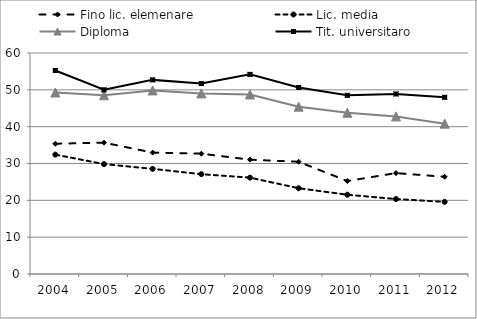
| Category | Fino lic. elemenare | Lic. media | Diploma | Tit. universitaro |
|---|---|---|---|---|
| 2004 | 35.369 | 32.41 | 49.277 | 55.242 |
| 2005 | 35.656 | 29.836 | 48.528 | 50.01 |
| 2006 | 32.962 | 28.546 | 49.841 | 52.702 |
| 2007 | 32.667 | 27.101 | 49.037 | 51.705 |
| 2008 | 31.038 | 26.163 | 48.75 | 54.193 |
| 2009 | 30.472 | 23.286 | 45.432 | 50.636 |
| 2010 | 25.241 | 21.523 | 43.773 | 48.504 |
| 2011 | 27.398 | 20.354 | 42.785 | 48.878 |
| 2012 | 26.395 | 19.578 | 40.818 | 47.975 |